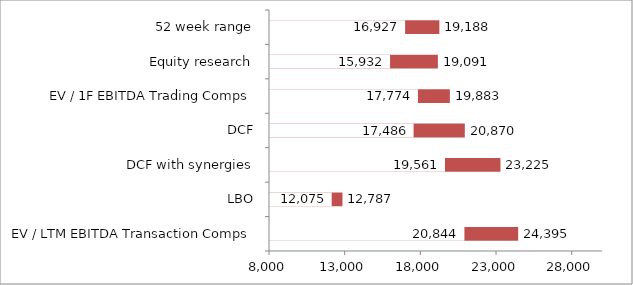
| Category | Series 1 | Series 0 |
|---|---|---|
| EV / LTM EBITDA Transaction Comps | 24395.2 | 20844 |
| LBO | 12787 | 12075 |
| DCF with synergies | 23224.6 | 19560.6 |
| DCF | 20870.1 | 17486.4 |
| EV / 1F EBITDA Trading Comps | 19883.2 | 17774.3 |
| Equity research | 19091.4 | 15931.9 |
| 52 week range | 19187.7 | 16927.1 |